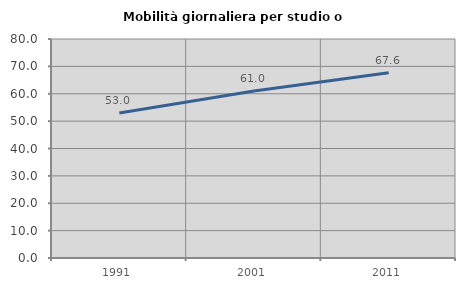
| Category | Mobilità giornaliera per studio o lavoro |
|---|---|
| 1991.0 | 53.002 |
| 2001.0 | 60.976 |
| 2011.0 | 67.64 |